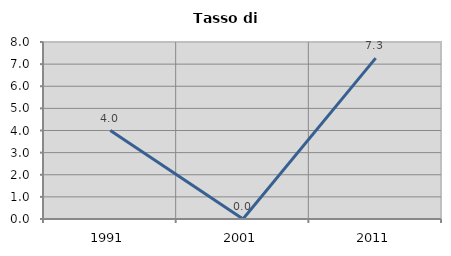
| Category | Tasso di disoccupazione   |
|---|---|
| 1991.0 | 4 |
| 2001.0 | 0 |
| 2011.0 | 7.273 |